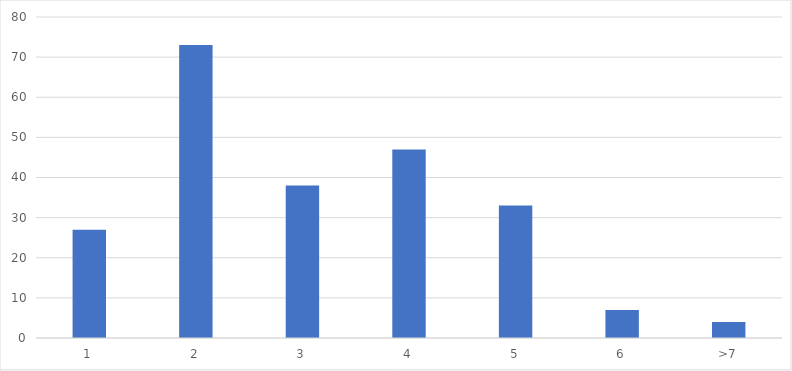
| Category | Number of Responses |
|---|---|
| 1 | 27 |
| 2 | 73 |
| 3 | 38 |
| 4 | 47 |
| 5 | 33 |
| 6 | 7 |
| >7 | 4 |